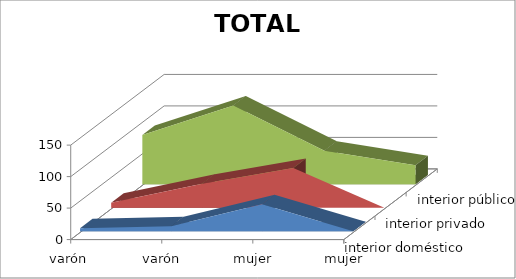
| Category | interior doméstico | interior privado | interior público |
|---|---|---|---|
| varón  profesional | 5 | 8 | 78 |
| varón usuario | 8 | 38 | 125 |
| mujer "usuaria" | 43 | 63 | 53 |
| mujer profesional | 0 | 0 | 30 |